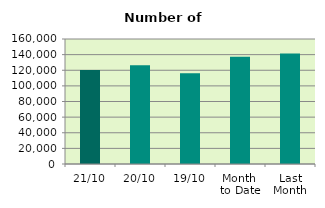
| Category | Series 0 |
|---|---|
| 21/10 | 120396 |
| 20/10 | 126404 |
| 19/10 | 116128 |
| Month 
to Date | 137250.267 |
| Last
Month | 141428.727 |